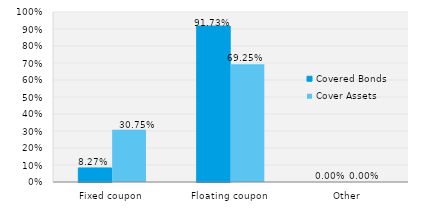
| Category | Covered Bonds | Cover Assets |
|---|---|---|
| Fixed coupon | 0.083 | 0.308 |
| Floating coupon | 0.917 | 0.692 |
| Other | 0 | 0 |